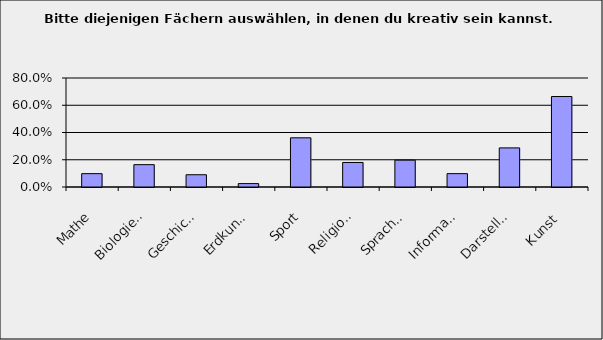
| Category | Series 0 |
|---|---|
| Mathe | 0.098 |
| Biologie/ Chemie/ Physik | 0.164 |
| Geschichte | 0.09 |
| Erdkunde | 0.025 |
| Sport | 0.361 |
| Religion/Ethik | 0.18 |
| Sprachen | 0.197 |
| Informatik | 0.098 |
| Darstellendes Spiel/Musik | 0.287 |
| Kunst | 0.664 |